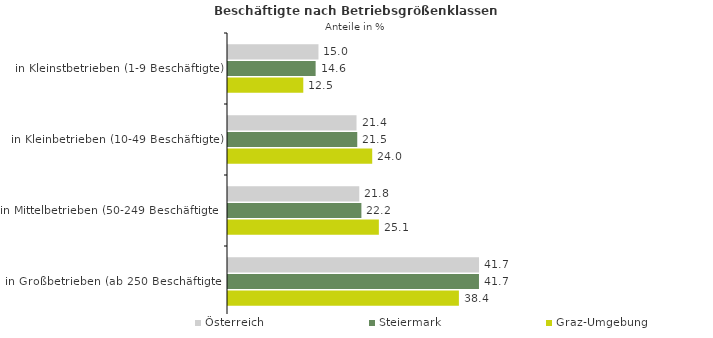
| Category | Österreich | Steiermark | Graz-Umgebung |
|---|---|---|---|
| in Kleinstbetrieben (1-9 Beschäftigte) | 15.046 | 14.574 | 12.522 |
| in Kleinbetrieben (10-49 Beschäftigte) | 21.375 | 21.498 | 23.986 |
| in Mittelbetrieben (50-249 Beschäftigte) | 21.831 | 22.187 | 25.09 |
| in Großbetrieben (ab 250 Beschäftigte) | 41.748 | 41.742 | 38.403 |